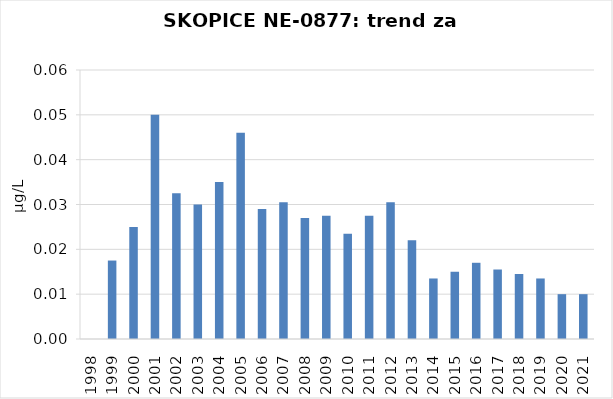
| Category | Vsota |
|---|---|
| 1998 | 0 |
| 1999 | 0.018 |
| 2000 | 0.025 |
| 2001 | 0.05 |
| 2002 | 0.032 |
| 2003 | 0.03 |
| 2004 | 0.035 |
| 2005 | 0.046 |
| 2006 | 0.029 |
| 2007 | 0.03 |
| 2008 | 0.027 |
| 2009 | 0.028 |
| 2010 | 0.024 |
| 2011 | 0.028 |
| 2012 | 0.03 |
| 2013 | 0.022 |
| 2014 | 0.014 |
| 2015 | 0.015 |
| 2016 | 0.017 |
| 2017 | 0.016 |
| 2018 | 0.014 |
| 2019 | 0.014 |
| 2020 | 0.01 |
| 2021 | 0.01 |